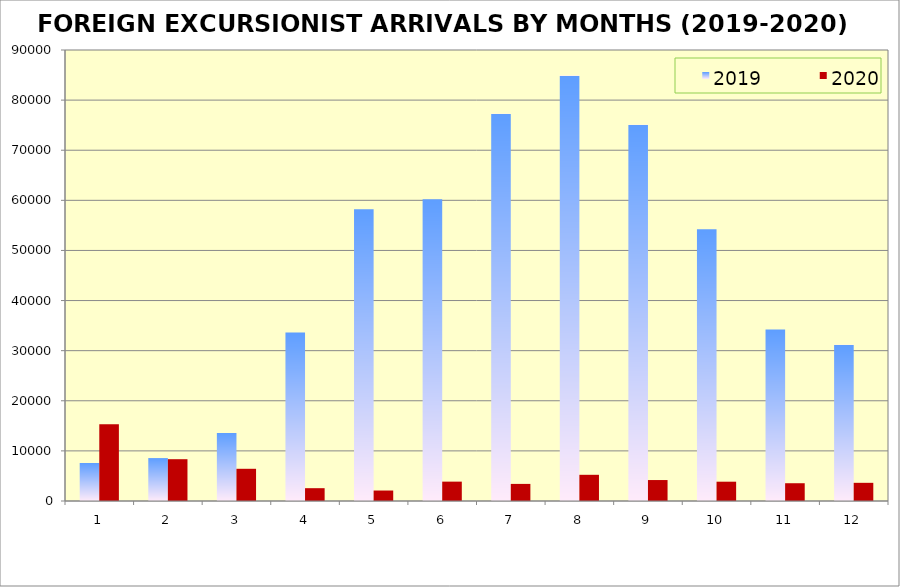
| Category | 2019 | 2020 |
|---|---|---|
| 0 | 7589 | 15315 |
| 1 | 8565 | 8341 |
| 2 | 13594 | 6427 |
| 3 | 33640 | 2557 |
| 4 | 58228 | 2090 |
| 5 | 60198 | 3865 |
| 6 | 77293 | 3412 |
| 7 | 84888 | 5227 |
| 8 | 75094 | 4182 |
| 9 | 54225 | 3852 |
| 10 | 34240 | 3546 |
| 11 | 31164 | 3627 |